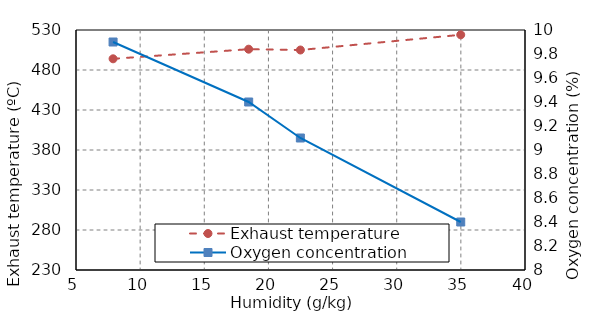
| Category | Exhaust temperature |
|---|---|
| 7.89 | 494 |
| 18.46 | 506 |
| 22.49 | 505 |
| 34.99 | 524 |